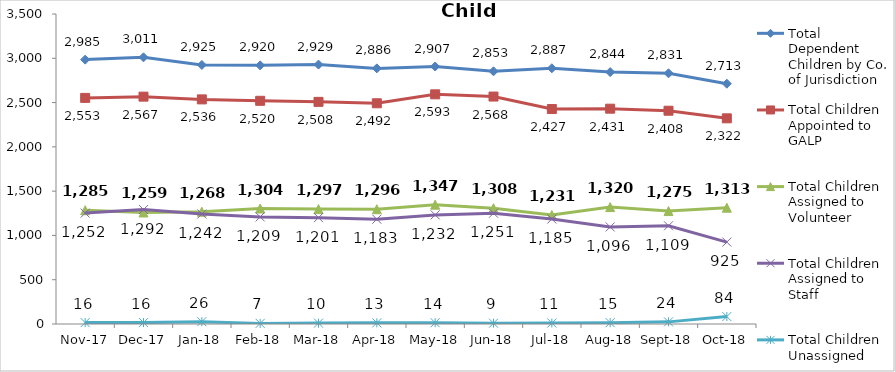
| Category | Total Dependent Children by Co. of Jurisdiction | Total Children Appointed to GALP | Total Children Assigned to Volunteer | Total Children Assigned to Staff | Total Children Unassigned |
|---|---|---|---|---|---|
| 2017-11-01 | 2985 | 2553 | 1285 | 1252 | 16 |
| 2017-12-01 | 3011 | 2567 | 1259 | 1292 | 16 |
| 2018-01-01 | 2925 | 2536 | 1268 | 1242 | 26 |
| 2018-02-01 | 2920 | 2520 | 1304 | 1209 | 7 |
| 2018-03-01 | 2929 | 2508 | 1297 | 1201 | 10 |
| 2018-04-01 | 2886 | 2492 | 1296 | 1183 | 13 |
| 2018-05-01 | 2907 | 2593 | 1347 | 1232 | 14 |
| 2018-06-01 | 2853 | 2568 | 1308 | 1251 | 9 |
| 2018-07-01 | 2887 | 2427 | 1231 | 1185 | 11 |
| 2018-08-01 | 2844 | 2431 | 1320 | 1096 | 15 |
| 2018-09-01 | 2831 | 2408 | 1275 | 1109 | 24 |
| 2018-10-01 | 2713 | 2322 | 1313 | 925 | 84 |